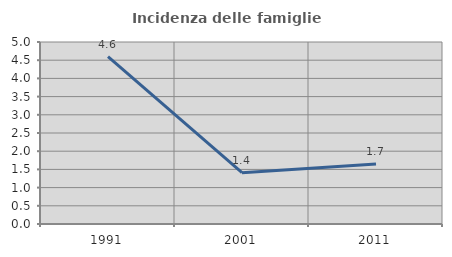
| Category | Incidenza delle famiglie numerose |
|---|---|
| 1991.0 | 4.601 |
| 2001.0 | 1.408 |
| 2011.0 | 1.651 |